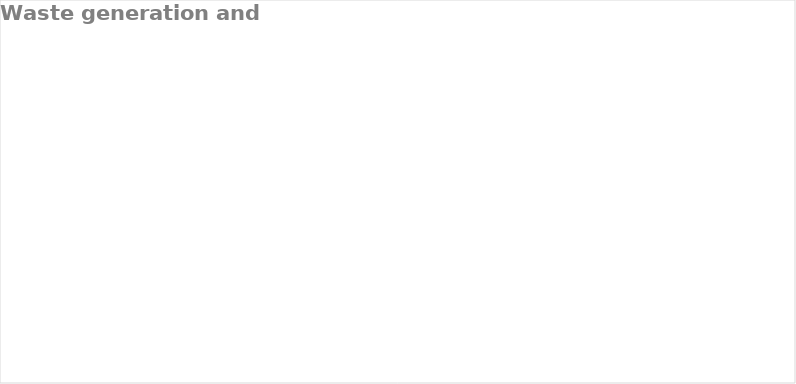
| Category | Series 0 |
|---|---|
| Reuse | 0 |
| Recycle | 0 |
| Recover for energy | 0 |
| Treat/Dispose | 0 |